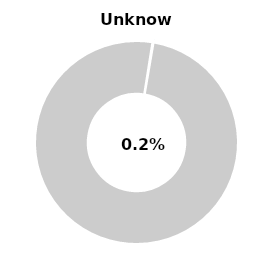
| Category | Series 0 |
|---|---|
| Unknown | 0.002 |
| Other | 0.998 |